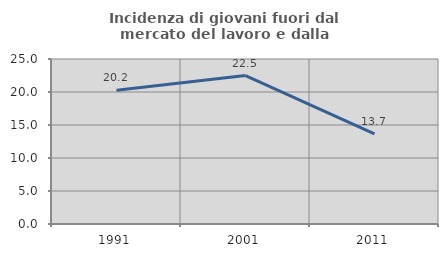
| Category | Incidenza di giovani fuori dal mercato del lavoro e dalla formazione  |
|---|---|
| 1991.0 | 20.249 |
| 2001.0 | 22.492 |
| 2011.0 | 13.662 |